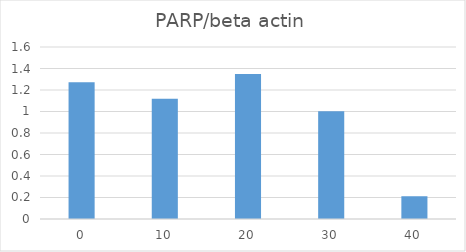
| Category | PARP/beta actin |
|---|---|
| 0.0 | 1.272 |
| 10.0 | 1.119 |
| 20.0 | 1.35 |
| 30.0 | 1.003 |
| 40.0 | 0.212 |